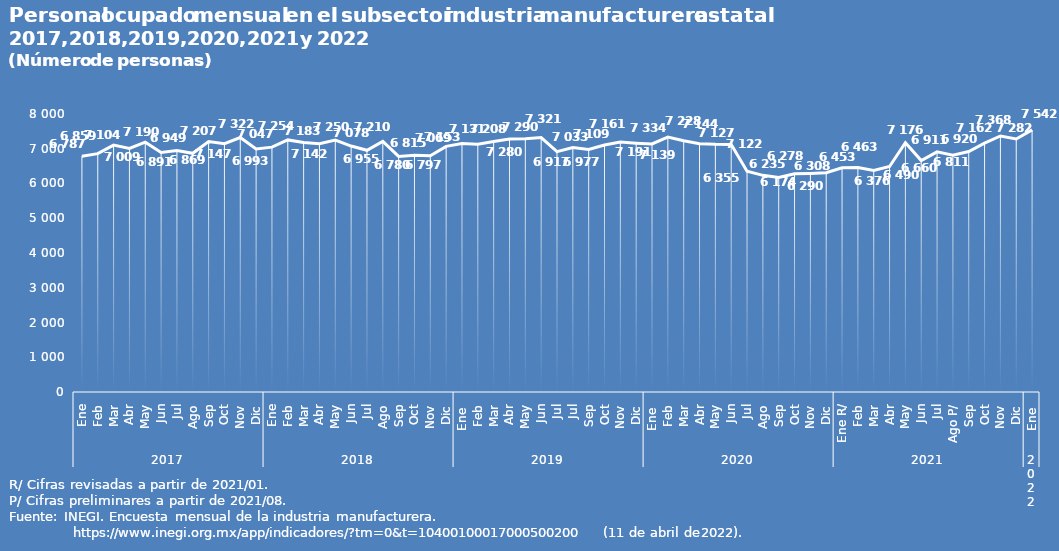
| Category | Series 0 |
|---|---|
| 0 | 6787 |
| 1 | 6859 |
| 2 | 7104 |
| 3 | 7009 |
| 4 | 7190 |
| 5 | 6891 |
| 6 | 6949 |
| 7 | 6869 |
| 8 | 7207 |
| 9 | 7147 |
| 10 | 7322 |
| 11 | 6993 |
| 12 | 7047 |
| 13 | 7254 |
| 14 | 7183 |
| 15 | 7142 |
| 16 | 7250 |
| 17 | 7078 |
| 18 | 6955 |
| 19 | 7210 |
| 20 | 6780 |
| 21 | 6815 |
| 22 | 6797 |
| 23 | 7069 |
| 24 | 7153 |
| 25 | 7131 |
| 26 | 7208 |
| 27 | 7280 |
| 28 | 7290 |
| 29 | 7321 |
| 30 | 6917 |
| 31 | 7033 |
| 32 | 6977 |
| 33 | 7109 |
| 34 | 7191 |
| 35 | 7161 |
| 36 | 7139 |
| 37 | 7334 |
| 38 | 7228 |
| 39 | 7144 |
| 40 | 7127 |
| 41 | 7122 |
| 42 | 6355 |
| 43 | 6235 |
| 44 | 6174 |
| 45 | 6278 |
| 46 | 6290 |
| 47 | 6308 |
| 48 | 6453 |
| 49 | 6463 |
| 50 | 6376 |
| 51 | 6490 |
| 52 | 7176 |
| 53 | 6660 |
| 54 | 6911 |
| 55 | 6811 |
| 56 | 6920 |
| 57 | 7162 |
| 58 | 7368 |
| 59 | 7282 |
| 60 | 7542 |